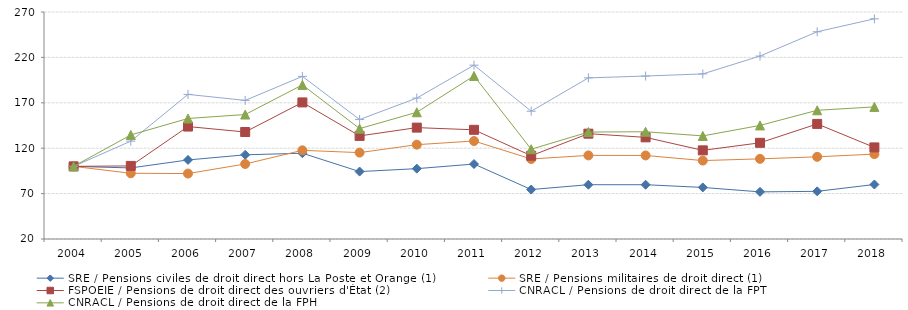
| Category | SRE / Pensions civiles de droit direct hors La Poste et Orange (1) | SRE / Pensions militaires de droit direct (1) | FSPOEIE / Pensions de droit direct des ouvriers d'État (2) | CNRACL / Pensions de droit direct de la FPT | CNRACL / Pensions de droit direct de la FPH |
|---|---|---|---|---|---|
| 2004.0 | 100 | 100 | 100 | 100 | 100 |
| 2005.0 | 98.28 | 92.393 | 100.496 | 127.752 | 134.603 |
| 2006.0 | 107.072 | 92.08 | 143.833 | 179.252 | 152.734 |
| 2007.0 | 112.71 | 102.615 | 137.83 | 172.662 | 157.071 |
| 2008.0 | 114.462 | 117.658 | 170.43 | 199.075 | 189.712 |
| 2009.0 | 94.251 | 115.119 | 133.535 | 151.573 | 141.544 |
| 2010.0 | 97.486 | 123.882 | 142.676 | 175.23 | 159.573 |
| 2011.0 | 102.557 | 127.918 | 140.253 | 211.445 | 199.606 |
| 2012.0 | 74.478 | 108.138 | 111.729 | 160.742 | 118.873 |
| 2013.0 | 79.791 | 112.069 | 136.013 | 197.457 | 137.779 |
| 2014.0 | 79.791 | 112.002 | 131.938 | 199.465 | 138.102 |
| 2015.0 | 76.786 | 106.357 | 117.621 | 201.807 | 133.524 |
| 2016.0 | 71.908 | 108.271 | 125.936 | 221.485 | 145.094 |
| 2017.0 | 72.493 | 110.502 | 146.751 | 248.226 | 161.745 |
| 2018.0 | 80.031 | 113.502 | 120.87 | 262.476 | 165.485 |